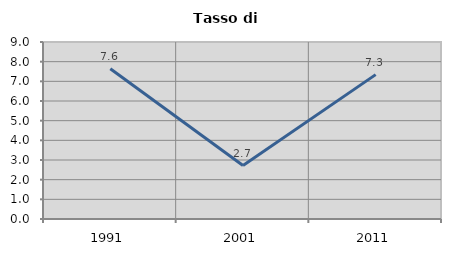
| Category | Tasso di disoccupazione   |
|---|---|
| 1991.0 | 7.637 |
| 2001.0 | 2.717 |
| 2011.0 | 7.341 |